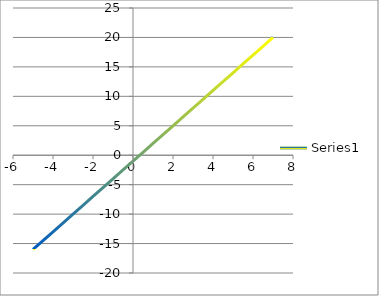
| Category | Series 0 |
|---|---|
| -5.0 | -16 |
| -4.0 | -13 |
| -3.0 | -10 |
| -2.0 | -7 |
| -1.0 | -4 |
| 0.0 | -1 |
| 1.0 | 2 |
| 2.0 | 5 |
| 3.0 | 8 |
| 4.0 | 11 |
| 5.0 | 14 |
| 6.0 | 17 |
| 7.0 | 20 |